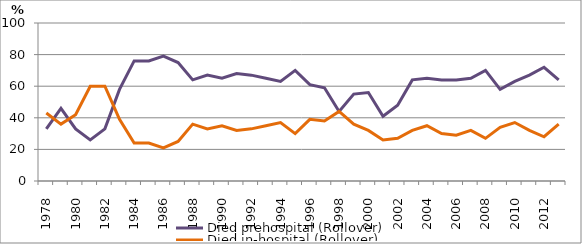
| Category | Died prehospital (Rollover) | Died in-hospital (Rollover) |
|---|---|---|
| 1978.0 | 33 | 43 |
| 1979.0 | 46 | 36 |
| 1980.0 | 33 | 42 |
| 1981.0 | 26 | 60 |
| 1982.0 | 33 | 60 |
| 1983.0 | 58 | 39 |
| 1984.0 | 76 | 24 |
| 1985.0 | 76 | 24 |
| 1986.0 | 79 | 21 |
| 1987.0 | 75 | 25 |
| 1988.0 | 64 | 36 |
| 1989.0 | 67 | 33 |
| 1990.0 | 65 | 35 |
| 1991.0 | 68 | 32 |
| 1992.0 | 67 | 33 |
| 1993.0 | 65 | 35 |
| 1994.0 | 63 | 37 |
| 1995.0 | 70 | 30 |
| 1996.0 | 61 | 39 |
| 1997.0 | 59 | 38 |
| 1998.0 | 44 | 44 |
| 1999.0 | 55 | 36 |
| 2000.0 | 56 | 32 |
| 2001.0 | 41 | 26 |
| 2002.0 | 48 | 27 |
| 2003.0 | 64 | 32 |
| 2004.0 | 65 | 35 |
| 2005.0 | 64 | 30 |
| 2006.0 | 64 | 29 |
| 2007.0 | 65 | 32 |
| 2008.0 | 70 | 27 |
| 2009.0 | 58 | 34 |
| 2010.0 | 63 | 37 |
| 2011.0 | 67 | 32 |
| 2012.0 | 72 | 28 |
| 2013.0 | 64 | 36 |